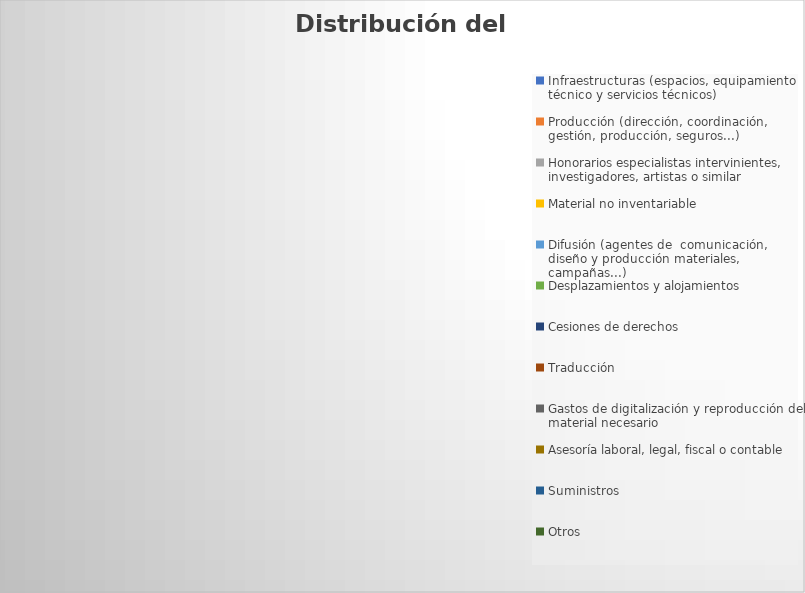
| Category | Series 0 |
|---|---|
| Infraestructuras (espacios, equipamiento técnico y servicios técnicos) | 0 |
| Producción (dirección, coordinación, gestión, producción, seguros...) | 0 |
| Honorarios especialistas intervinientes, investigadores, artistas o similar | 0 |
| Material no inventariable | 0 |
| Difusión (agentes de  comunicación, diseño y producción materiales, campañas...) | 0 |
| Desplazamientos y alojamientos | 0 |
| Cesiones de derechos | 0 |
| Traducción | 0 |
| Gastos de digitalización y reproducción del material necesario | 0 |
| Asesoría laboral, legal, fiscal o contable | 0 |
| Suministros | 0 |
| Otros | 0 |